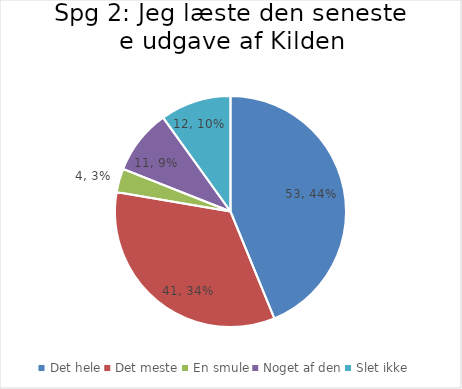
| Category | Svar |
|---|---|
| Det hele | 53 |
| Det meste | 41 |
| En smule | 4 |
| Noget af den | 11 |
| Slet ikke | 12 |